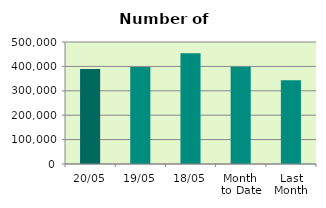
| Category | Series 0 |
|---|---|
| 20/05 | 389700 |
| 19/05 | 397766 |
| 18/05 | 453746 |
| Month 
to Date | 398347.385 |
| Last
Month | 343067.2 |